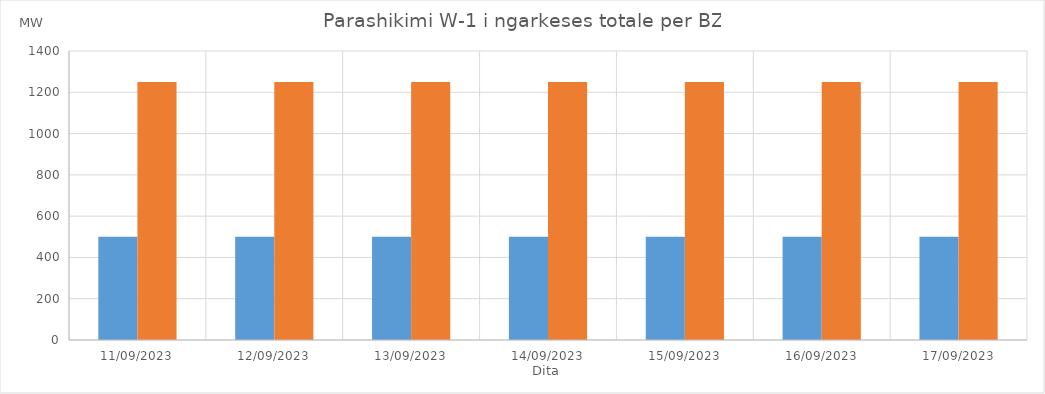
| Category | Min (MW) | Max (MW) |
|---|---|---|
| 11/09/2023 | 500 | 1250 |
| 12/09/2023 | 500 | 1250 |
| 13/09/2023 | 500 | 1250 |
| 14/09/2023 | 500 | 1250 |
| 15/09/2023 | 500 | 1250 |
| 16/09/2023 | 500 | 1250 |
| 17/09/2023 | 500 | 1250 |